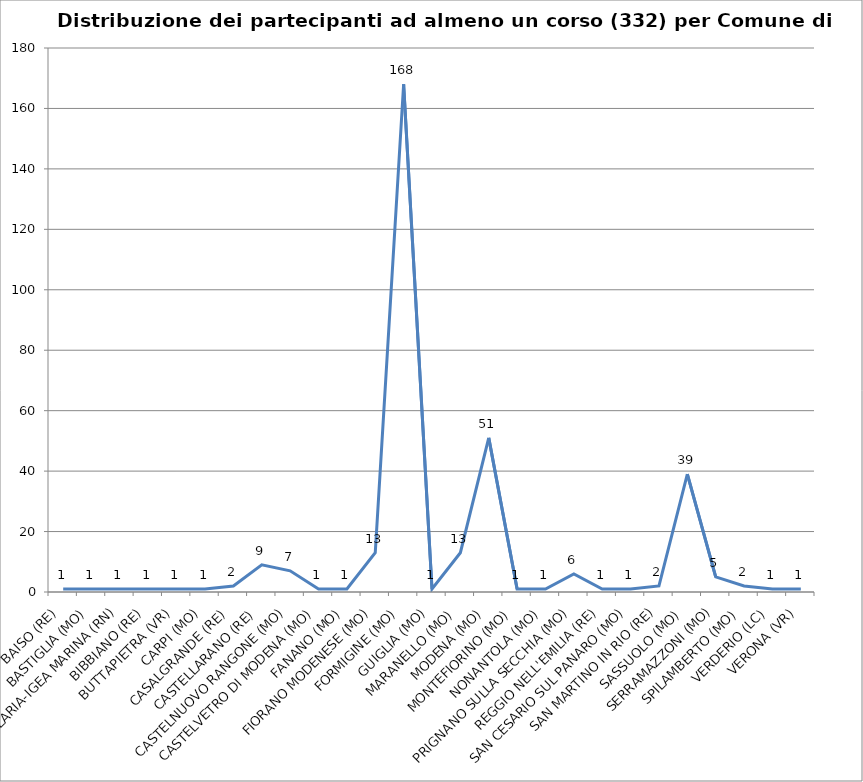
| Category | Nr. Tesserati |
|---|---|
| BAISO (RE) | 1 |
| BASTIGLIA (MO) | 1 |
| BELLARIA-IGEA MARINA (RN) | 1 |
| BIBBIANO (RE) | 1 |
| BUTTAPIETRA (VR) | 1 |
| CARPI (MO) | 1 |
| CASALGRANDE (RE) | 2 |
| CASTELLARANO (RE) | 9 |
| CASTELNUOVO RANGONE (MO) | 7 |
| CASTELVETRO DI MODENA (MO) | 1 |
| FANANO (MO) | 1 |
| FIORANO MODENESE (MO) | 13 |
| FORMIGINE (MO) | 168 |
| GUIGLIA (MO) | 1 |
| MARANELLO (MO) | 13 |
| MODENA (MO) | 51 |
| MONTEFIORINO (MO) | 1 |
| NONANTOLA (MO) | 1 |
| PRIGNANO SULLA SECCHIA (MO) | 6 |
| REGGIO NELL'EMILIA (RE) | 1 |
| SAN CESARIO SUL PANARO (MO) | 1 |
| SAN MARTINO IN RIO (RE) | 2 |
| SASSUOLO (MO) | 39 |
| SERRAMAZZONI (MO) | 5 |
| SPILAMBERTO (MO) | 2 |
| VERDERIO (LC) | 1 |
| VERONA (VR) | 1 |